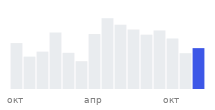
| Category | Продажи |
|---|---|
| окт |  |
|  |  |
|  |  |
|  |  |
|  |  |
|  |  |
| апр |  |
|  |  |
|  |  |
|  |  |
|  |  |
|  |  |
| окт |  |